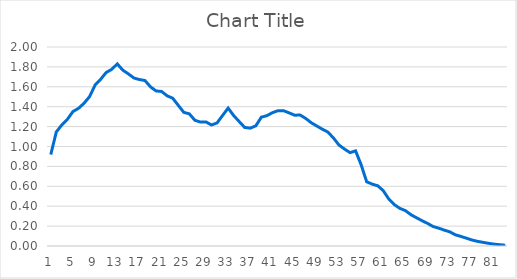
| Category | Series 0 |
|---|---|
| 0 | 0.919 |
| 1 | 1.146 |
| 2 | 1.217 |
| 3 | 1.273 |
| 4 | 1.351 |
| 5 | 1.383 |
| 6 | 1.434 |
| 7 | 1.501 |
| 8 | 1.618 |
| 9 | 1.676 |
| 10 | 1.744 |
| 11 | 1.775 |
| 12 | 1.83 |
| 13 | 1.767 |
| 14 | 1.73 |
| 15 | 1.688 |
| 16 | 1.673 |
| 17 | 1.663 |
| 18 | 1.599 |
| 19 | 1.558 |
| 20 | 1.553 |
| 21 | 1.509 |
| 22 | 1.486 |
| 23 | 1.414 |
| 24 | 1.343 |
| 25 | 1.328 |
| 26 | 1.264 |
| 27 | 1.246 |
| 28 | 1.247 |
| 29 | 1.216 |
| 30 | 1.237 |
| 31 | 1.312 |
| 32 | 1.386 |
| 33 | 1.311 |
| 34 | 1.251 |
| 35 | 1.191 |
| 36 | 1.184 |
| 37 | 1.208 |
| 38 | 1.295 |
| 39 | 1.31 |
| 40 | 1.34 |
| 41 | 1.36 |
| 42 | 1.36 |
| 43 | 1.338 |
| 44 | 1.315 |
| 45 | 1.316 |
| 46 | 1.282 |
| 47 | 1.239 |
| 48 | 1.206 |
| 49 | 1.174 |
| 50 | 1.145 |
| 51 | 1.086 |
| 52 | 1.015 |
| 53 | 0.974 |
| 54 | 0.938 |
| 55 | 0.956 |
| 56 | 0.816 |
| 57 | 0.645 |
| 58 | 0.622 |
| 59 | 0.605 |
| 60 | 0.556 |
| 61 | 0.472 |
| 62 | 0.415 |
| 63 | 0.378 |
| 64 | 0.355 |
| 65 | 0.314 |
| 66 | 0.284 |
| 67 | 0.254 |
| 68 | 0.227 |
| 69 | 0.195 |
| 70 | 0.179 |
| 71 | 0.16 |
| 72 | 0.142 |
| 73 | 0.112 |
| 74 | 0.097 |
| 75 | 0.078 |
| 76 | 0.06 |
| 77 | 0.047 |
| 78 | 0.037 |
| 79 | 0.027 |
| 80 | 0.019 |
| 81 | 0.013 |
| 82 | 0.007 |